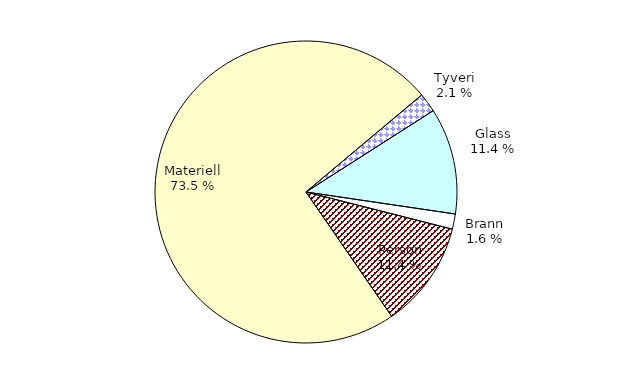
| Category | Series 0 |
|---|---|
| Tyveri | 246.198 |
| Glass | 1361.082 |
| Brann | 194.722 |
| Person | 1367.333 |
| Materiell | 8787.42 |